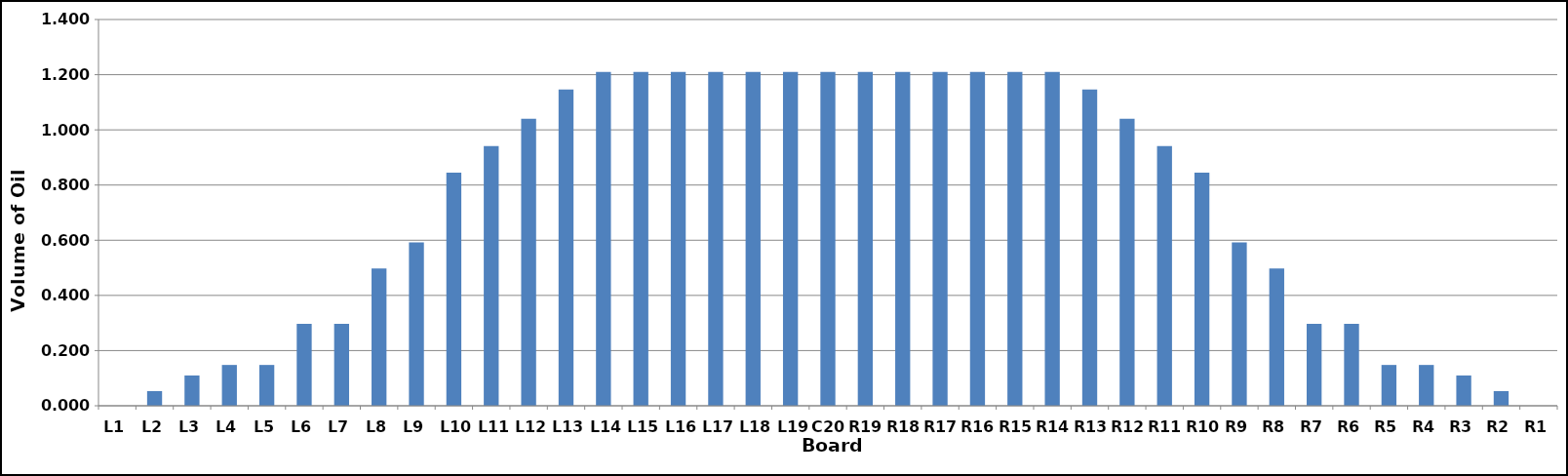
| Category | Series 0 |
|---|---|
| L1 | 0 |
| L2 | 0.053 |
| L3 | 0.11 |
| L4 | 0.148 |
| L5 | 0.148 |
| L6 | 0.297 |
| L7 | 0.297 |
| L8 | 0.498 |
| L9 | 0.592 |
| L10 | 0.845 |
| L11 | 0.941 |
| L12 | 1.04 |
| L13 | 1.146 |
| L14 | 1.21 |
| L15 | 1.21 |
| L16 | 1.21 |
| L17 | 1.21 |
| L18 | 1.21 |
| L19 | 1.21 |
| C20 | 1.21 |
| R19 | 1.21 |
| R18 | 1.21 |
| R17 | 1.21 |
| R16 | 1.21 |
| R15 | 1.21 |
| R14 | 1.21 |
| R13 | 1.146 |
| R12 | 1.04 |
| R11 | 0.941 |
| R10 | 0.845 |
| R9 | 0.592 |
| R8 | 0.498 |
| R7 | 0.297 |
| R6 | 0.297 |
| R5 | 0.148 |
| R4 | 0.148 |
| R3 | 0.11 |
| R2 | 0.053 |
| R1 | 0 |